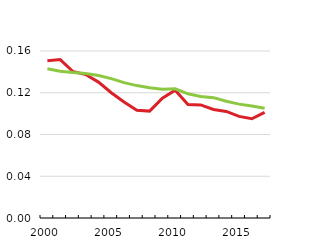
| Category | Latvia | OECD |
|---|---|---|
| 2000.0 | 0.151 | 0.143 |
| 2001.0 | 0.152 | 0.141 |
| 2002.0 | 0.14 | 0.139 |
| 2003.0 | 0.137 | 0.138 |
| 2004.0 | 0.13 | 0.137 |
| 2005.0 | 0.12 | 0.134 |
| 2006.0 | 0.111 | 0.13 |
| 2007.0 | 0.103 | 0.127 |
| 2008.0 | 0.102 | 0.125 |
| 2009.0 | 0.115 | 0.123 |
| 2010.0 | 0.122 | 0.124 |
| 2011.0 | 0.109 | 0.119 |
| 2012.0 | 0.108 | 0.116 |
| 2013.0 | 0.104 | 0.115 |
| 2014.0 | 0.102 | 0.112 |
| 2015.0 | 0.097 | 0.109 |
| 2016.0 | 0.095 | 0.107 |
| 2017.0 | 0.101 | 0.105 |